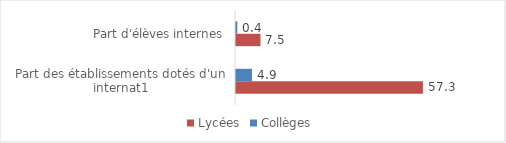
| Category | Lycées | Collèges |
|---|---|---|
| Part des établissements dotés d'un internat1 | 57.3 | 4.9 |
| Part d'élèves internes | 7.5 | 0.4 |